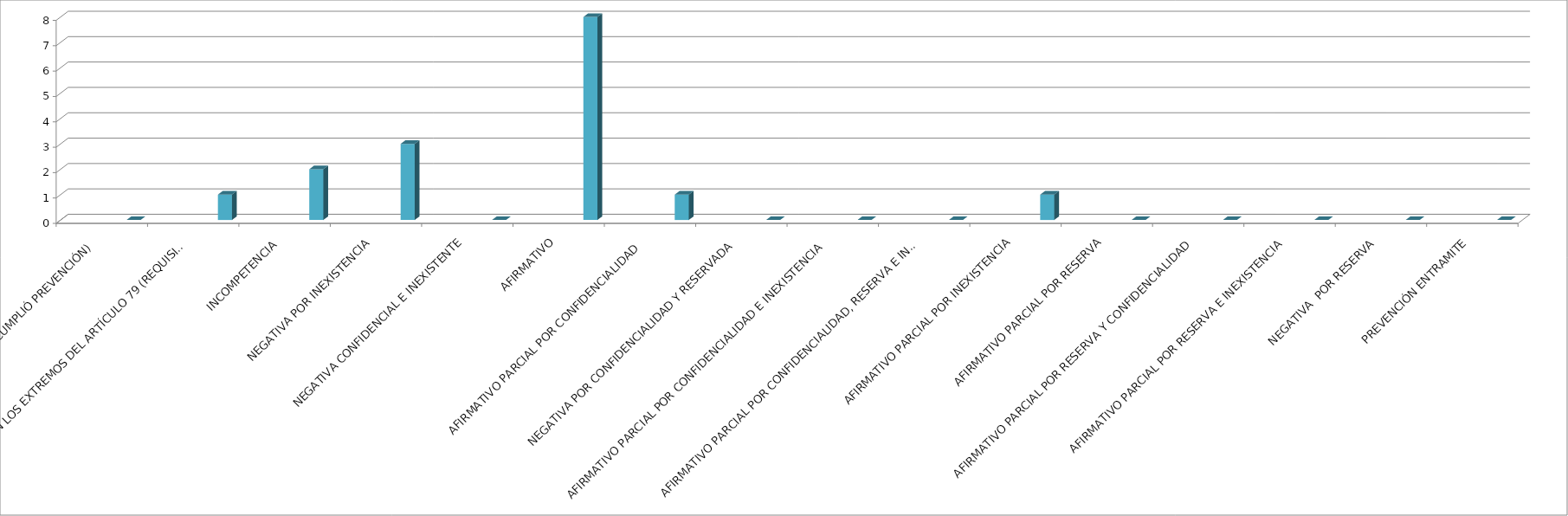
| Category | Series 0 | Series 1 | Series 2 | Series 3 | Series 4 |
|---|---|---|---|---|---|
| SE TIENE POR NO PRESENTADA ( NO CUMPLIÓ PREVENCIÓN) |  |  |  |  | 0 |
| NO CUMPLIO CON LOS EXTREMOS DEL ARTÍCULO 79 (REQUISITOS) |  |  |  |  | 1 |
| INCOMPETENCIA  |  |  |  |  | 2 |
| NEGATIVA POR INEXISTENCIA |  |  |  |  | 3 |
| NEGATIVA CONFIDENCIAL E INEXISTENTE |  |  |  |  | 0 |
| AFIRMATIVO |  |  |  |  | 8 |
| AFIRMATIVO PARCIAL POR CONFIDENCIALIDAD  |  |  |  |  | 1 |
| NEGATIVA POR CONFIDENCIALIDAD Y RESERVADA |  |  |  |  | 0 |
| AFIRMATIVO PARCIAL POR CONFIDENCIALIDAD E INEXISTENCIA |  |  |  |  | 0 |
| AFIRMATIVO PARCIAL POR CONFIDENCIALIDAD, RESERVA E INEXISTENCIA |  |  |  |  | 0 |
| AFIRMATIVO PARCIAL POR INEXISTENCIA |  |  |  |  | 1 |
| AFIRMATIVO PARCIAL POR RESERVA |  |  |  |  | 0 |
| AFIRMATIVO PARCIAL POR RESERVA Y CONFIDENCIALIDAD |  |  |  |  | 0 |
| AFIRMATIVO PARCIAL POR RESERVA E INEXISTENCIA |  |  |  |  | 0 |
| NEGATIVA  POR RESERVA |  |  |  |  | 0 |
| PREVENCIÓN ENTRAMITE |  |  |  |  | 0 |